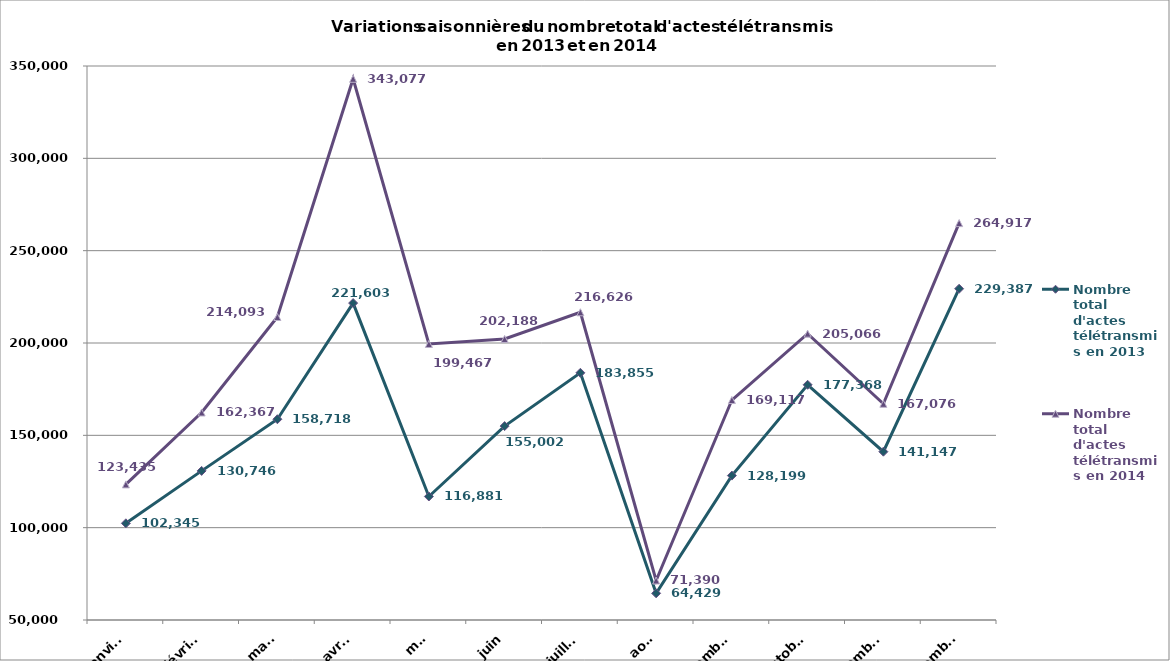
| Category | Nombre total d'actes télétransmis en 2013 | Nombre total d'actes télétransmis en 2014 |
|---|---|---|
| janvier | 102345 | 123435 |
| février | 130746 | 162367 |
| mars | 158718 | 214093 |
| avril | 221603 | 343077 |
| mai | 116881 | 199467 |
| juin | 155002 | 202188 |
| juillet | 183855 | 216626 |
| août | 64429 | 71390 |
| septembre | 128199 | 169117 |
| octobre | 177368 | 205066 |
| novembre | 141147 | 167076 |
| décembre | 229387 | 264917 |